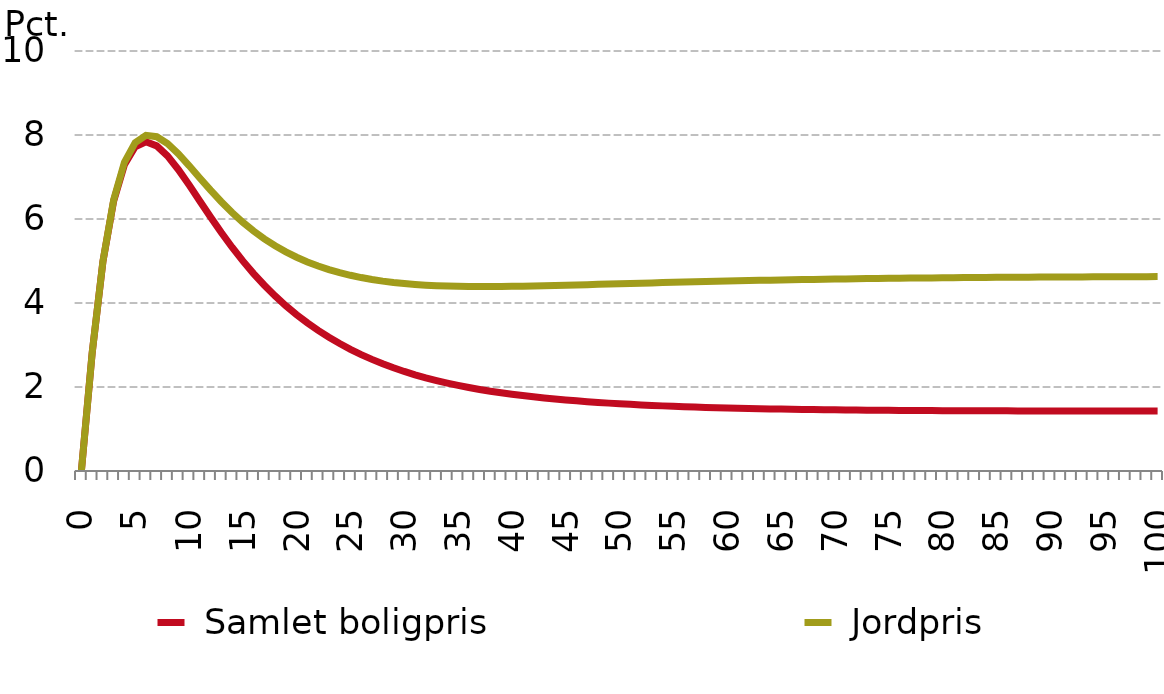
| Category |  Samlet boligpris |  Jordpris |
|---|---|---|
| 0.0 | 0 | 0 |
| nan | 2.807 | 2.807 |
| nan | 4.982 | 4.989 |
| nan | 6.431 | 6.455 |
| nan | 7.293 | 7.348 |
| 5.0 | 7.721 | 7.819 |
| nan | 7.838 | 7.992 |
| nan | 7.741 | 7.96 |
| nan | 7.503 | 7.796 |
| nan | 7.18 | 7.554 |
| 10.0 | 6.813 | 7.272 |
| nan | 6.429 | 6.978 |
| nan | 6.047 | 6.687 |
| nan | 5.678 | 6.411 |
| nan | 5.329 | 6.155 |
| 15.0 | 5.002 | 5.923 |
| nan | 4.701 | 5.713 |
| nan | 4.423 | 5.527 |
| nan | 4.168 | 5.362 |
| nan | 3.935 | 5.217 |
| 20.0 | 3.722 | 5.089 |
| nan | 3.526 | 4.978 |
| nan | 3.348 | 4.881 |
| nan | 3.184 | 4.796 |
| nan | 3.034 | 4.723 |
| 25.0 | 2.897 | 4.66 |
| nan | 2.772 | 4.606 |
| nan | 2.657 | 4.56 |
| nan | 2.553 | 4.521 |
| nan | 2.457 | 4.489 |
| 30.0 | 2.37 | 4.462 |
| nan | 2.29 | 4.441 |
| nan | 2.218 | 4.424 |
| nan | 2.152 | 4.412 |
| nan | 2.092 | 4.402 |
| 35.0 | 2.037 | 4.396 |
| nan | 1.987 | 4.393 |
| nan | 1.942 | 4.391 |
| nan | 1.9 | 4.392 |
| nan | 1.862 | 4.394 |
| 40.0 | 1.827 | 4.397 |
| nan | 1.795 | 4.401 |
| nan | 1.766 | 4.406 |
| nan | 1.739 | 4.411 |
| nan | 1.714 | 4.417 |
| 45.0 | 1.691 | 4.424 |
| nan | 1.67 | 4.43 |
| nan | 1.651 | 4.437 |
| nan | 1.633 | 4.444 |
| nan | 1.616 | 4.451 |
| 50.0 | 1.601 | 4.458 |
| nan | 1.587 | 4.465 |
| nan | 1.574 | 4.472 |
| nan | 1.562 | 4.479 |
| nan | 1.551 | 4.486 |
| 55.0 | 1.54 | 4.492 |
| nan | 1.531 | 4.499 |
| nan | 1.522 | 4.505 |
| nan | 1.514 | 4.511 |
| nan | 1.507 | 4.517 |
| 60.0 | 1.5 | 4.523 |
| nan | 1.494 | 4.529 |
| nan | 1.488 | 4.534 |
| nan | 1.483 | 4.539 |
| nan | 1.478 | 4.544 |
| 65.0 | 1.474 | 4.549 |
| nan | 1.469 | 4.554 |
| nan | 1.466 | 4.558 |
| nan | 1.462 | 4.562 |
| nan | 1.459 | 4.566 |
| 70.0 | 1.456 | 4.57 |
| nan | 1.453 | 4.574 |
| nan | 1.451 | 4.578 |
| nan | 1.449 | 4.581 |
| nan | 1.446 | 4.584 |
| 75.0 | 1.445 | 4.587 |
| nan | 1.443 | 4.59 |
| nan | 1.441 | 4.593 |
| nan | 1.44 | 4.595 |
| nan | 1.438 | 4.598 |
| 80.0 | 1.437 | 4.6 |
| nan | 1.436 | 4.603 |
| nan | 1.435 | 4.605 |
| nan | 1.434 | 4.607 |
| nan | 1.433 | 4.609 |
| 85.0 | 1.432 | 4.61 |
| nan | 1.432 | 4.612 |
| nan | 1.431 | 4.614 |
| nan | 1.43 | 4.615 |
| nan | 1.43 | 4.617 |
| 90.0 | 1.429 | 4.618 |
| nan | 1.429 | 4.619 |
| nan | 1.428 | 4.621 |
| nan | 1.428 | 4.622 |
| nan | 1.428 | 4.623 |
| 95.0 | 1.427 | 4.624 |
| nan | 1.427 | 4.625 |
| nan | 1.427 | 4.626 |
| nan | 1.427 | 4.627 |
| nan | 1.427 | 4.627 |
| 100.0 | 1.426 | 4.628 |